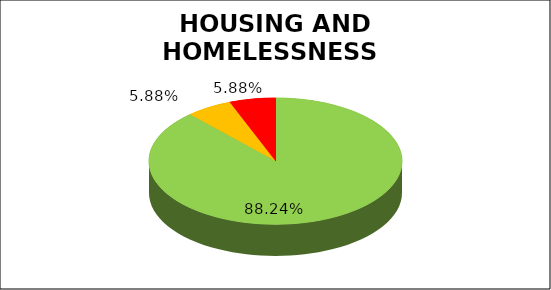
| Category | Series 0 |
|---|---|
| Green | 0.882 |
| Amber | 0.059 |
| Red | 0.059 |